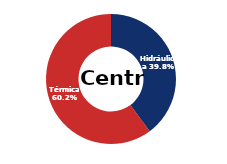
| Category | Centro |
|---|---|
| Eólica | 0 |
| Hidráulica | 1642.156 |
| Solar | 0.006 |
| Térmica | 2478.839 |